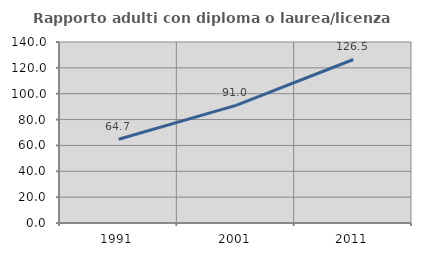
| Category | Rapporto adulti con diploma o laurea/licenza media  |
|---|---|
| 1991.0 | 64.747 |
| 2001.0 | 91.006 |
| 2011.0 | 126.467 |